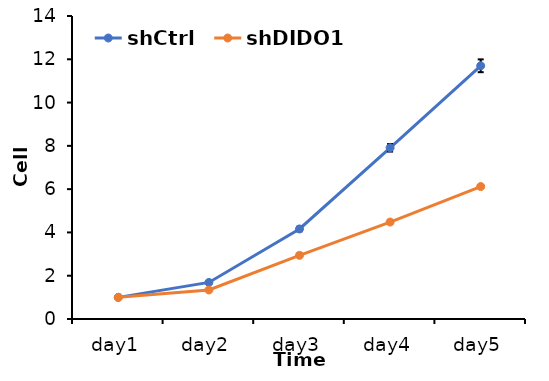
| Category | shCtrl | shDIDO1 |
|---|---|---|
| day1 | 1 | 1 |
| day2 | 1.69 | 1.34 |
| day3 | 4.16 | 2.94 |
| day4 | 7.91 | 4.48 |
| day5 | 11.7 | 6.12 |